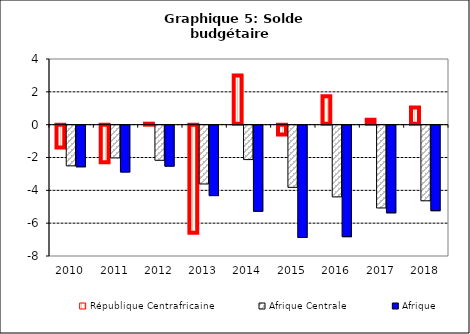
| Category | République Centrafricaine | Afrique Centrale | Afrique |
|---|---|---|---|
| 2010.0 | -1.452 | -2.477 | -2.535 |
| 2011.0 | -2.355 | -1.995 | -2.853 |
| 2012.0 | -0.002 | -2.14 | -2.495 |
| 2013.0 | -6.643 | -3.581 | -4.291 |
| 2014.0 | 2.989 | -2.096 | -5.245 |
| 2015.0 | -0.664 | -3.788 | -6.84 |
| 2016.0 | 1.724 | -4.368 | -6.79 |
| 2017.0 | 0.307 | -5.043 | -5.342 |
| 2018.0 | 1.046 | -4.606 | -5.208 |